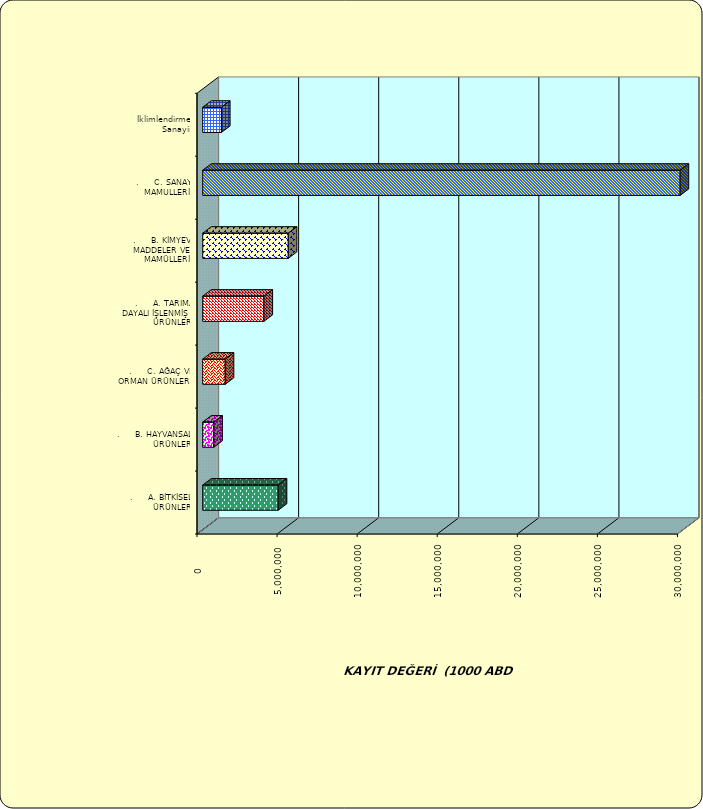
| Category | Series 0 |
|---|---|
| .     A. BİTKİSEL ÜRÜNLER | 4716004.94 |
| .     B. HAYVANSAL ÜRÜNLER | 692623.774 |
| .     C. AĞAÇ VE ORMAN ÜRÜNLERİ | 1405817.904 |
| .     A. TARIMA DAYALI İŞLENMİŞ ÜRÜNLER | 3826818.133 |
| .     B. KİMYEVİ MADDELER VE MAMÜLLERİ | 5344445.2 |
| .     C. SANAYİ MAMULLERİ | 29810251.209 |
|  İklimlendirme Sanayii | 1172206.117 |